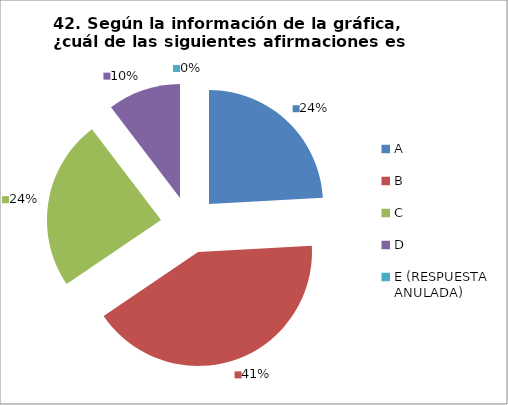
| Category | CANTIDAD DE RESPUESTAS PREGUNTA (42) | PORCENTAJE |
|---|---|---|
| A | 7 | 0.241 |
| B | 12 | 0.414 |
| C | 7 | 0.241 |
| D | 3 | 0.103 |
| E (RESPUESTA ANULADA) | 0 | 0 |